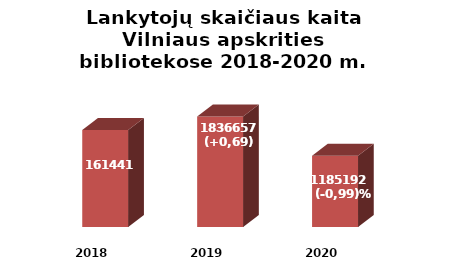
| Category | Series 0 |
|---|---|
| 2018.0 | 1614411 |
| 2019.0 | 1836657 |
| 2020.0 | 1185192 |